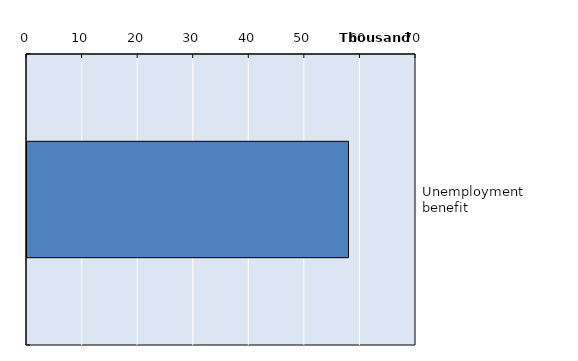
| Category | Series 0 |
|---|---|
| Unemployment benefit | 57854 |